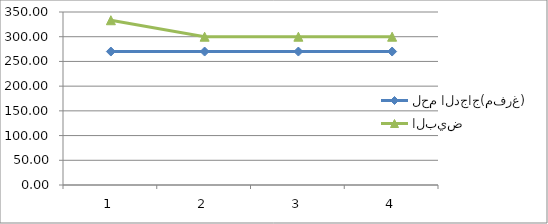
| Category | لحم الدجاج(مفرغ) | البيض |
|---|---|---|
| 0 | 270 | 333.33 |
| 1 | 270 | 300 |
| 2 | 270 | 300 |
| 3 | 270 | 300 |